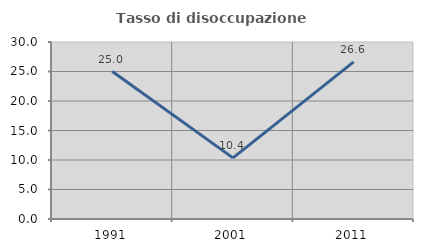
| Category | Tasso di disoccupazione giovanile  |
|---|---|
| 1991.0 | 25 |
| 2001.0 | 10.36 |
| 2011.0 | 26.619 |